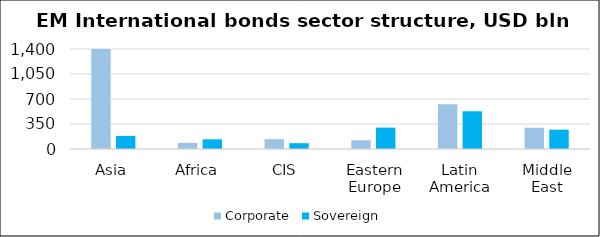
| Category | Corporate | Sovereign |
|---|---|---|
| Asia | 1663.091 | 183.454 |
| Africa | 85.394 | 135.451 |
| CIS | 137.063 | 81.423 |
| Eastern Europe | 123.289 | 299.228 |
| Latin America | 625.527 | 528.046 |
| Middle East | 297.293 | 270.787 |